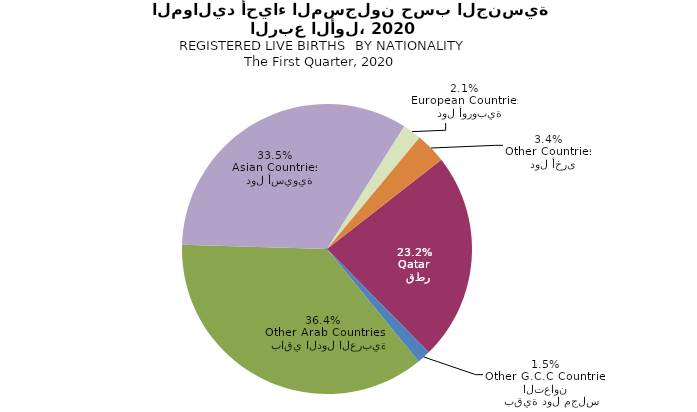
| Category | Series 0 |
|---|---|
|   قطر
Qatar | 1248 |
|   بقية دول مجلس التعاون
Other G.C.C Countries | 80 |
|   باقي الدول العربية
Other Arab Countries | 1957 |
|   دول أسيوية
Asian Countries | 1802 |
|   دول أوروبية
European Countries | 112 |
|   دول أخرى
Other Countries | 184 |